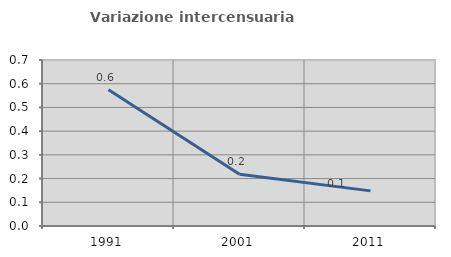
| Category | Variazione intercensuaria annua |
|---|---|
| 1991.0 | 0.574 |
| 2001.0 | 0.218 |
| 2011.0 | 0.148 |